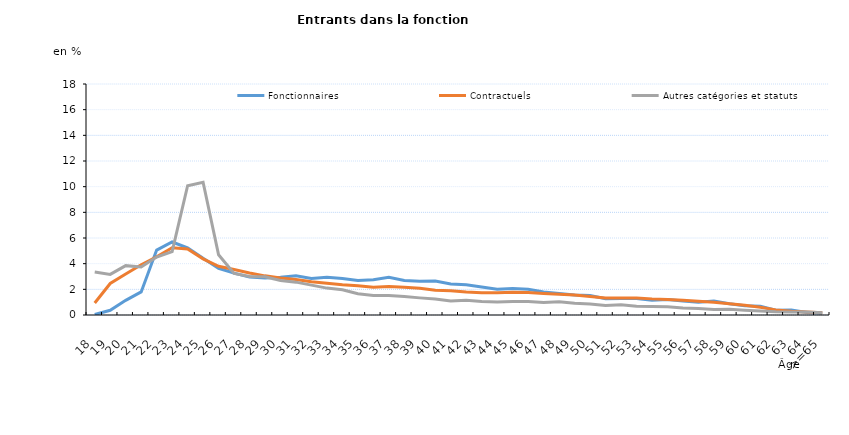
| Category | Fonctionnaires | Contractuels | Autres catégories et statuts |
|---|---|---|---|
| 18 | 0.039 | 0.931 | 3.347 |
| 19 | 0.365 | 2.456 | 3.161 |
| 20 | 1.143 | 3.192 | 3.845 |
| 21 | 1.798 | 3.912 | 3.737 |
| 22 | 5.058 | 4.535 | 4.511 |
| 23 | 5.689 | 5.236 | 4.941 |
| 24 | 5.234 | 5.151 | 10.07 |
| 25 | 4.416 | 4.377 | 10.346 |
| 26 | 3.642 | 3.797 | 4.692 |
| 27 | 3.263 | 3.552 | 3.244 |
| 28 | 2.953 | 3.275 | 3.001 |
| 29 | 2.879 | 3.05 | 2.98 |
| 30 | 2.938 | 2.885 | 2.684 |
| 31 | 3.051 | 2.773 | 2.561 |
| 32 | 2.843 | 2.597 | 2.327 |
| 33 | 2.935 | 2.482 | 2.096 |
| 34 | 2.847 | 2.364 | 1.96 |
| 35 | 2.689 | 2.285 | 1.654 |
| 36 | 2.748 | 2.171 | 1.515 |
| 37 | 2.937 | 2.23 | 1.518 |
| 38 | 2.69 | 2.164 | 1.445 |
| 39 | 2.629 | 2.083 | 1.334 |
| 40 | 2.64 | 1.924 | 1.246 |
| 41 | 2.421 | 1.884 | 1.086 |
| 42 | 2.36 | 1.787 | 1.154 |
| 43 | 2.186 | 1.731 | 1.053 |
| 44 | 2.012 | 1.73 | 1.013 |
| 45 | 2.073 | 1.77 | 1.045 |
| 46 | 2.007 | 1.76 | 1.043 |
| 47 | 1.794 | 1.682 | 0.975 |
| 48 | 1.685 | 1.624 | 1.038 |
| 49 | 1.557 | 1.556 | 0.907 |
| 50 | 1.526 | 1.436 | 0.862 |
| 51 | 1.274 | 1.329 | 0.744 |
| 52 | 1.291 | 1.325 | 0.802 |
| 53 | 1.29 | 1.325 | 0.686 |
| 54 | 1.156 | 1.256 | 0.666 |
| 55 | 1.209 | 1.217 | 0.643 |
| 56 | 1.096 | 1.149 | 0.548 |
| 57 | 0.988 | 1.065 | 0.51 |
| 58 | 1.094 | 0.997 | 0.43 |
| 59 | 0.883 | 0.882 | 0.455 |
| 60 | 0.72 | 0.758 | 0.38 |
| 61 | 0.684 | 0.603 | 0.314 |
| 62 | 0.378 | 0.399 | 0.259 |
| 63 | 0.395 | 0.292 | 0.239 |
| 64 | 0.199 | 0.229 | 0.239 |
| >=65 | 0.152 | 0.177 | 0.184 |